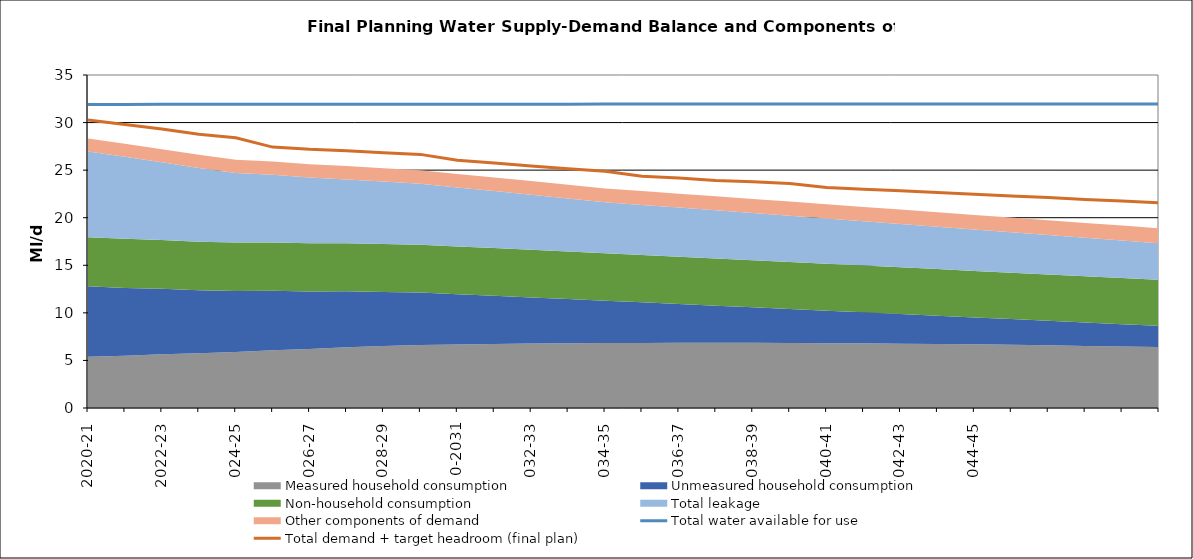
| Category | Total water available for use | Total demand + target headroom (final plan) |
|---|---|---|
| 2020-21 | 31.907 | 30.271 |
| 2021-22 | 31.91 | 29.786 |
| 2022-23 | 31.913 | 29.324 |
| 2023-24 | 31.916 | 28.778 |
| 2024-25 | 31.919 | 28.395 |
| 2025-26 | 31.922 | 27.423 |
| 2026-27 | 31.925 | 27.187 |
| 2027-28 | 31.928 | 27.041 |
| 2028-29 | 31.931 | 26.84 |
| 2029-30 | 31.934 | 26.657 |
| 2030-31 | 31.936 | 26.037 |
| 2031-32 | 31.937 | 25.754 |
| 2032-33 | 31.938 | 25.439 |
| 2033-34 | 31.939 | 25.153 |
| 2034-35 | 31.94 | 24.874 |
| 2035-36 | 31.94 | 24.353 |
| 2036-37 | 31.941 | 24.167 |
| 2037-38 | 31.942 | 23.92 |
| 2038-39 | 31.943 | 23.785 |
| 2039-40 | 31.943 | 23.604 |
| 2040-41 | 31.944 | 23.186 |
| 2041-42 | 31.945 | 23.004 |
| 2042-43 | 31.946 | 22.823 |
| 2043-44 | 31.946 | 22.651 |
| 2044-45 | 31.947 | 22.47 |
| 2045-46 | 31.948 | 22.282 |
| 2046-47 | 31.949 | 22.112 |
| 2047-48 | 31.95 | 21.916 |
| 2048-49 | 31.95 | 21.746 |
| 2049-50 | 31.951 | 21.566 |